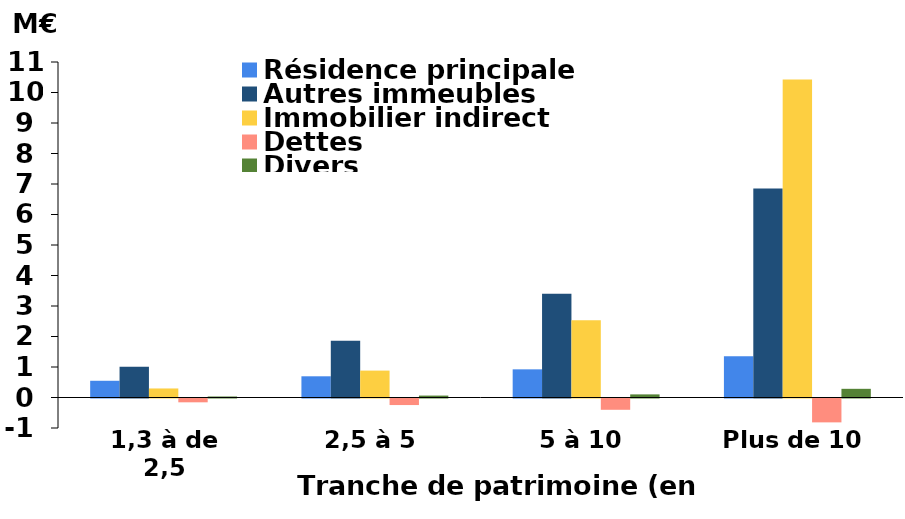
| Category | Résidence principale | Autres immeubles | Immobilier indirect | Dettes | Divers |
|---|---|---|---|---|---|
| 1,3 à de 2,5 | 0.548 | 1.009 | 0.296 | -0.125 | 0.033 |
| 2,5 à 5 | 0.695 | 1.861 | 0.882 | -0.215 | 0.063 |
| 5 à 10 | 0.923 | 3.403 | 2.533 | -0.37 | 0.102 |
| Plus de 10 | 1.352 | 6.851 | 10.43 | -0.783 | 0.285 |